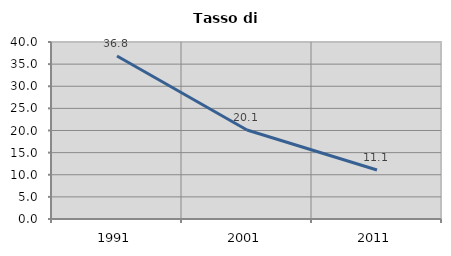
| Category | Tasso di disoccupazione   |
|---|---|
| 1991.0 | 36.829 |
| 2001.0 | 20.112 |
| 2011.0 | 11.082 |